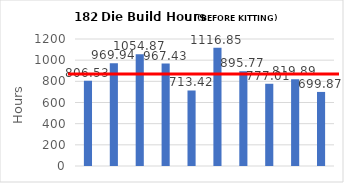
| Category | Series 0 |
|---|---|
| 8270-03 | 806.53 |
| 8270-05 | 969.94 |
| 8361-01 | 1054.87 |
| 8361-02 | 967.43 |
| 8361-03 | 713.42 |
| 8361-04 | 1116.85 |
| 8433-01 | 895.77 |
| 8439-01 | 777.01 |
| 8439-02 | 819.89 |
| 8439-03 | 699.87 |